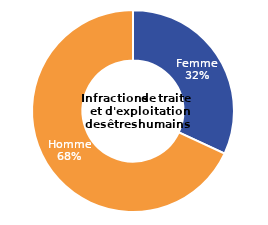
| Category | Infractions de traite et d'exploitation des êtres humains |
|---|---|
| Femme | 31.93 |
| Homme | 68.07 |